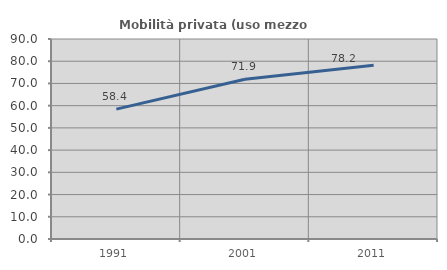
| Category | Mobilità privata (uso mezzo privato) |
|---|---|
| 1991.0 | 58.445 |
| 2001.0 | 71.92 |
| 2011.0 | 78.231 |